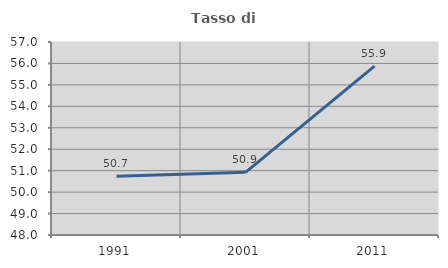
| Category | Tasso di occupazione   |
|---|---|
| 1991.0 | 50.74 |
| 2001.0 | 50.923 |
| 2011.0 | 55.873 |